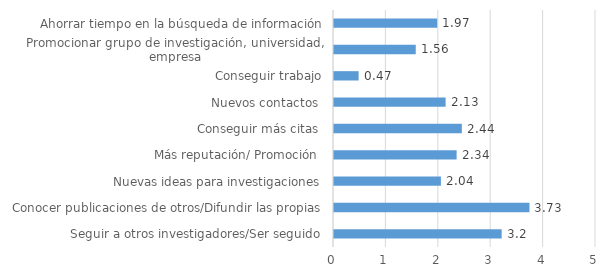
| Category | Series 0 |
|---|---|
| Seguir a otros investigadores/Ser seguido | 3.2 |
| Conocer publicaciones de otros/Difundir las propias | 3.73 |
| Nuevas ideas para investigaciones | 2.04 |
| Más reputación/ Promoción  | 2.34 |
| Conseguir más citas  | 2.44 |
| Nuevos contactos  | 2.13 |
| Conseguir trabajo | 0.47 |
| Promocionar grupo de investigación, universidad, empresa | 1.56 |
| Ahorrar tiempo en la búsqueda de información | 1.97 |